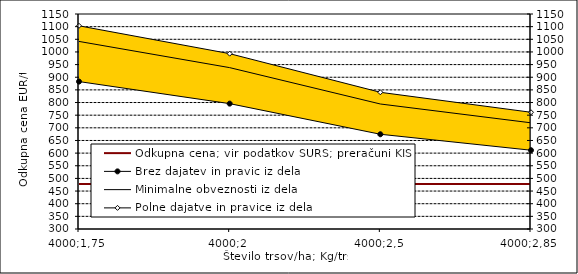
| Category | Odkupna cena; vir podatkov SURS; preračuni KIS |
|---|---|
| 4000;1,75 | 478 |
| 4000;2 | 478 |
| 4000;2,5 | 478 |